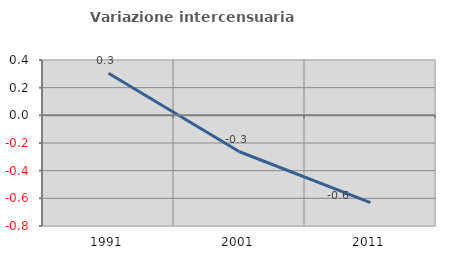
| Category | Variazione intercensuaria annua |
|---|---|
| 1991.0 | 0.304 |
| 2001.0 | -0.263 |
| 2011.0 | -0.631 |